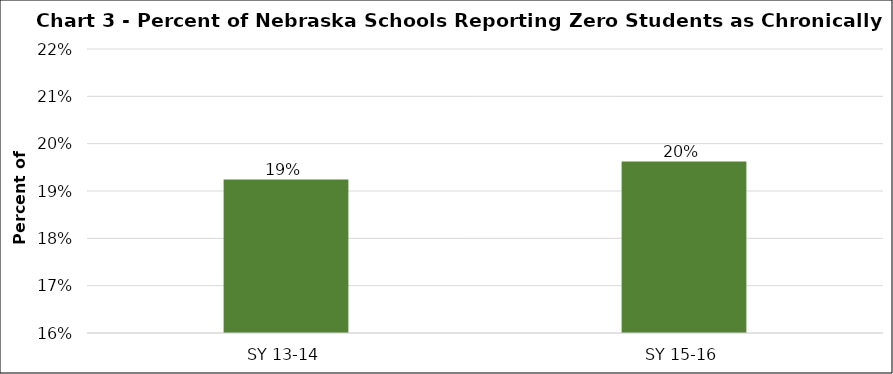
| Category | Series 0 |
|---|---|
| SY 13-14 | 0.192 |
| SY 15-16 | 0.196 |